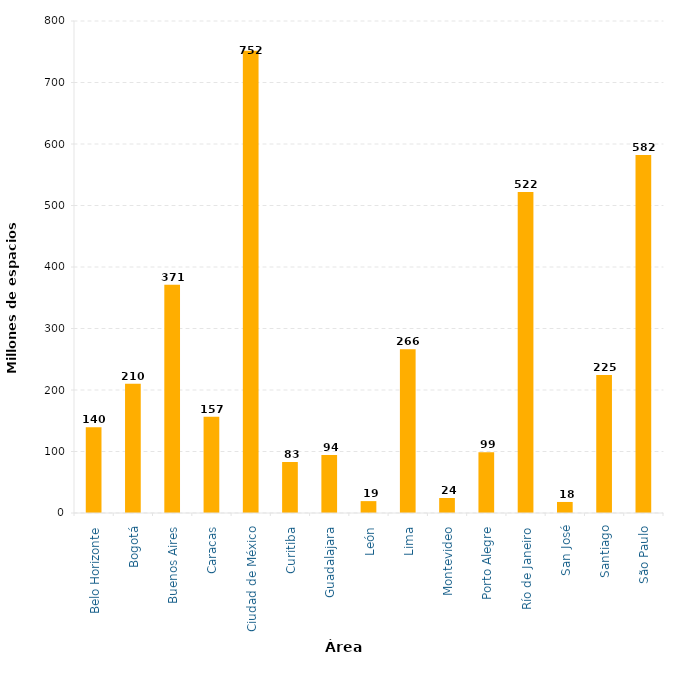
| Category | Millones de espacios disponibles-km/día |
|---|---|
| Belo Horizonte | 139.536 |
| Bogotá | 210.123 |
| Buenos Aires | 370.997 |
| Caracas | 156.57 |
| Ciudad de México | 751.624 |
| Curitiba | 82.9 |
| Guadalajara | 94.191 |
| León | 19.32 |
| Lima | 266.127 |
| Montevideo | 24.424 |
| Porto Alegre | 98.886 |
| Río de Janeiro | 521.99 |
| San José | 17.94 |
| Santiago | 224.505 |
| São Paulo | 582.032 |